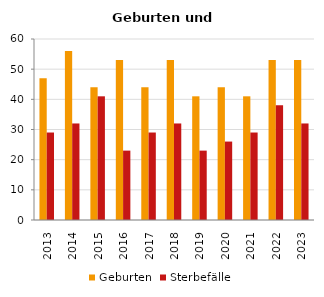
| Category | Geburten | Sterbefälle |
|---|---|---|
| 2013.0 | 47 | 29 |
| 2014.0 | 56 | 32 |
| 2015.0 | 44 | 41 |
| 2016.0 | 53 | 23 |
| 2017.0 | 44 | 29 |
| 2018.0 | 53 | 32 |
| 2019.0 | 41 | 23 |
| 2020.0 | 44 | 26 |
| 2021.0 | 41 | 29 |
| 2022.0 | 53 | 38 |
| 2023.0 | 53 | 32 |